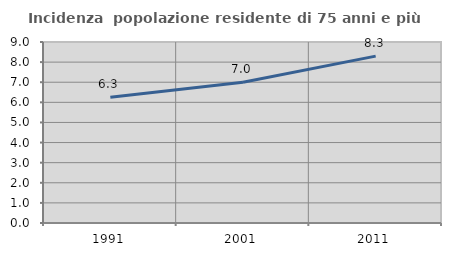
| Category | Incidenza  popolazione residente di 75 anni e più |
|---|---|
| 1991.0 | 6.258 |
| 2001.0 | 6.997 |
| 2011.0 | 8.297 |